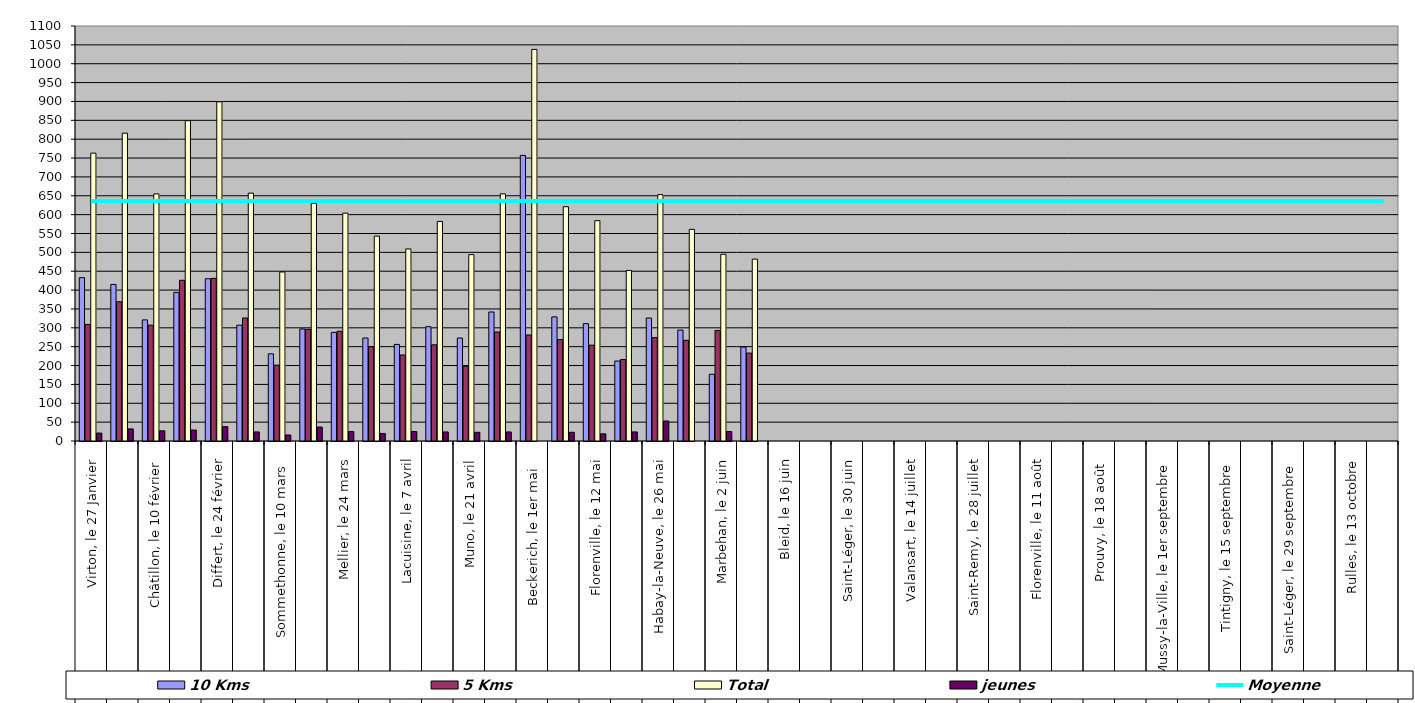
| Category | 10 Kms | 5 Kms | Total | jeunes |
|---|---|---|---|---|
| 0 | 433 | 309 | 763 | 21 |
| 1 | 415 | 369 | 816 | 32 |
| 2 | 321 | 307 | 655 | 27 |
| 3 | 394 | 426 | 849 | 29 |
| 4 | 430 | 431 | 899 | 38 |
| 5 | 307 | 326 | 657 | 24 |
| 6 | 231 | 201 | 448 | 16 |
| 7 | 297 | 296 | 630 | 37 |
| 8 | 288 | 291 | 604 | 25 |
| 9 | 273 | 250 | 543 | 20 |
| 10 | 256 | 228 | 509 | 25 |
| 11 | 303 | 255 | 582 | 24 |
| 12 | 273 | 198 | 494 | 23 |
| 13 | 342 | 289 | 655 | 24 |
| 14 | 757 | 281 | 1038 | 0 |
| 15 | 329 | 269 | 621 | 23 |
| 16 | 311 | 254 | 584 | 19 |
| 17 | 212 | 216 | 452 | 24 |
| 18 | 326 | 274 | 653 | 53 |
| 19 | 294 | 267 | 561 | 0 |
| 20 | 177 | 293 | 495 | 25 |
| 21 | 249 | 233 | 482 | 0 |
| 22 | 0 | 0 | 0 | 0 |
| 23 | 0 | 0 | 0 | 0 |
| 24 | 0 | 0 | 0 | 0 |
| 25 | 0 | 0 | 0 | 0 |
| 26 | 0 | 0 | 0 | 0 |
| 27 | 0 | 0 | 0 | 0 |
| 28 | 0 | 0 | 0 | 0 |
| 29 | 0 | 0 | 0 | 0 |
| 30 | 0 | 0 | 0 | 0 |
| 31 | 0 | 0 | 0 | 0 |
| 32 | 0 | 0 | 0 | 0 |
| 33 | 0 | 0 | 0 | 0 |
| 34 | 0 | 0 | 0 | 0 |
| 35 | 0 | 0 | 0 | 0 |
| 36 | 0 | 0 | 0 | 0 |
| 37 | 0 | 0 | 0 | 0 |
| 38 | 0 | 0 | 0 | 0 |
| 39 | 0 | 0 | 0 | 0 |
| 40 | 0 | 0 | 0 | 0 |
| 41 | 0 | 0 | 0 | 0 |